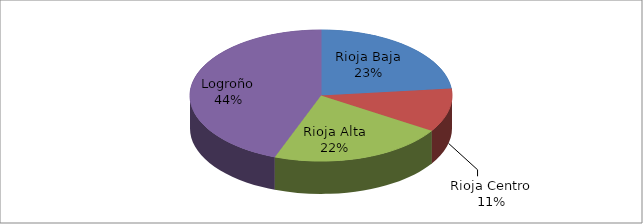
| Category | Series 0 |
|---|---|
| Rioja Baja | 1086 |
| Rioja Centro | 501 |
| Rioja Alta | 1012 |
| Logroño | 2065 |